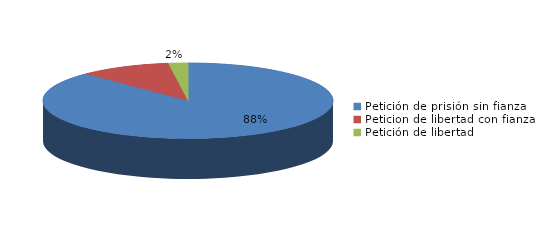
| Category | Series 0 |
|---|---|
| Petición de prisión sin fianza | 120 |
| Peticion de libertad con fianza | 14 |
| Petición de libertad | 3 |